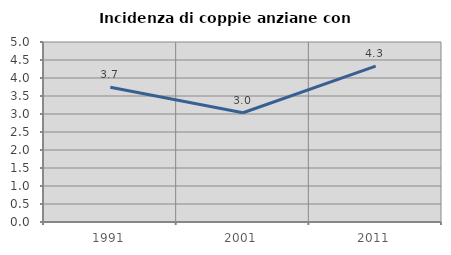
| Category | Incidenza di coppie anziane con figli |
|---|---|
| 1991.0 | 3.743 |
| 2001.0 | 3.035 |
| 2011.0 | 4.332 |